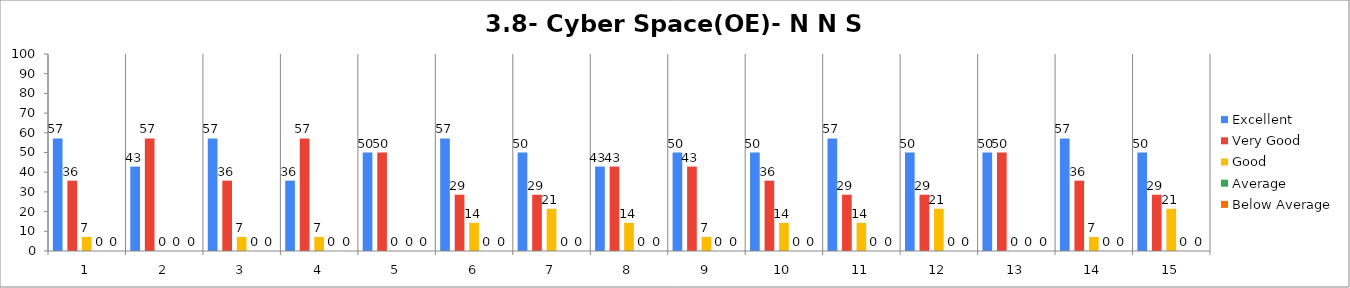
| Category | Excellent | Very Good | Good | Average | Below Average |
|---|---|---|---|---|---|
| 0 | 57.143 | 35.714 | 7.143 | 0 | 0 |
| 1 | 42.857 | 57.143 | 0 | 0 | 0 |
| 2 | 57.143 | 35.714 | 7.143 | 0 | 0 |
| 3 | 35.714 | 57.143 | 7.143 | 0 | 0 |
| 4 | 50 | 50 | 0 | 0 | 0 |
| 5 | 57.143 | 28.571 | 14.286 | 0 | 0 |
| 6 | 50 | 28.571 | 21.429 | 0 | 0 |
| 7 | 42.857 | 42.857 | 14.286 | 0 | 0 |
| 8 | 50 | 42.857 | 7.143 | 0 | 0 |
| 9 | 50 | 35.714 | 14.286 | 0 | 0 |
| 10 | 57.143 | 28.571 | 14.286 | 0 | 0 |
| 11 | 50 | 28.571 | 21.429 | 0 | 0 |
| 12 | 50 | 50 | 0 | 0 | 0 |
| 13 | 57.143 | 35.714 | 7.143 | 0 | 0 |
| 14 | 50 | 28.571 | 21.429 | 0 | 0 |